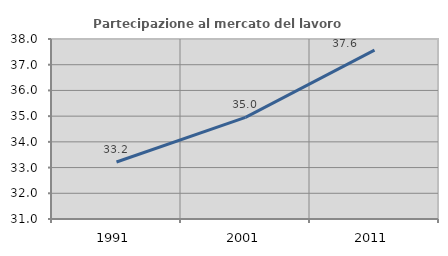
| Category | Partecipazione al mercato del lavoro  femminile |
|---|---|
| 1991.0 | 33.215 |
| 2001.0 | 34.953 |
| 2011.0 | 37.565 |